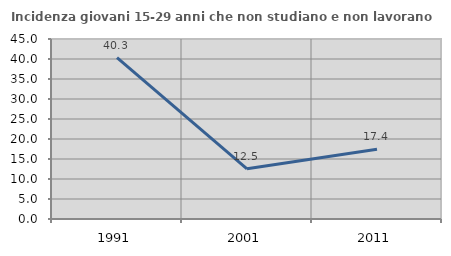
| Category | Incidenza giovani 15-29 anni che non studiano e non lavorano  |
|---|---|
| 1991.0 | 40.331 |
| 2001.0 | 12.541 |
| 2011.0 | 17.448 |